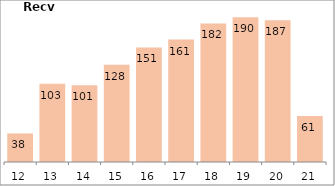
| Category | Debtor Days |
|---|---|
| 2012-03-31 | 37.627 |
| 2013-03-31 | 103.075 |
| 2014-03-31 | 101.021 |
| 2015-03-31 | 128.088 |
| 2016-03-31 | 150.714 |
| 2017-03-31 | 161.052 |
| 2018-03-31 | 182.257 |
| 2019-03-31 | 190.44 |
| 2020-03-31 | 186.526 |
| 2021-03-31 | 60.663 |